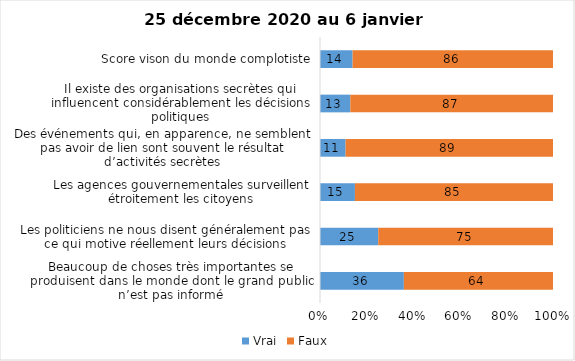
| Category | Vrai | Faux |
|---|---|---|
| Beaucoup de choses très importantes se produisent dans le monde dont le grand public n’est pas informé | 36 | 64 |
| Les politiciens ne nous disent généralement pas ce qui motive réellement leurs décisions | 25 | 75 |
| Les agences gouvernementales surveillent étroitement les citoyens | 15 | 85 |
| Des événements qui, en apparence, ne semblent pas avoir de lien sont souvent le résultat d’activités secrètes | 11 | 89 |
| Il existe des organisations secrètes qui influencent considérablement les décisions politiques | 13 | 87 |
| Score vison du monde complotiste | 14 | 86 |